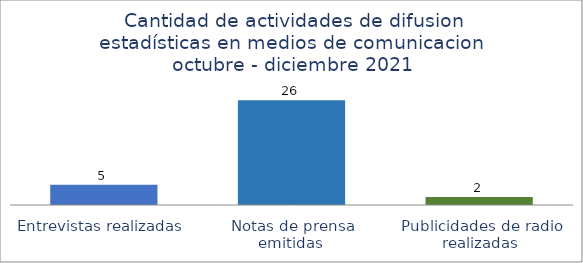
| Category | Series 0 |
|---|---|
| Entrevistas realizadas  | 5 |
| Notas de prensa emitidas  | 26 |
| Publicidades de radio realizadas | 2 |